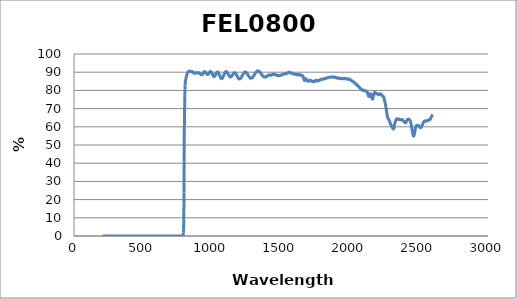
| Category | Series 0 |
|---|---|
| 2600.0 | 66.69 |
| 2599.0 | 66.587 |
| 2598.0 | 66.586 |
| 2597.0 | 66.471 |
| 2596.0 | 66.364 |
| 2595.0 | 66.221 |
| 2594.0 | 66.034 |
| 2593.0 | 66.01 |
| 2592.0 | 65.87 |
| 2591.0 | 65.696 |
| 2590.0 | 65.486 |
| 2589.0 | 65.442 |
| 2588.0 | 65.213 |
| 2587.0 | 65.061 |
| 2586.0 | 64.923 |
| 2585.0 | 64.748 |
| 2584.0 | 64.571 |
| 2583.0 | 64.417 |
| 2582.0 | 64.275 |
| 2581.0 | 64.216 |
| 2580.0 | 64.036 |
| 2579.0 | 63.983 |
| 2578.0 | 63.897 |
| 2577.0 | 63.949 |
| 2576.0 | 63.919 |
| 2575.0 | 63.792 |
| 2574.0 | 63.816 |
| 2573.0 | 63.752 |
| 2572.0 | 63.785 |
| 2571.0 | 63.826 |
| 2570.0 | 63.723 |
| 2569.0 | 63.686 |
| 2568.0 | 63.717 |
| 2567.0 | 63.574 |
| 2566.0 | 63.537 |
| 2565.0 | 63.42 |
| 2564.0 | 63.473 |
| 2563.0 | 63.444 |
| 2562.0 | 63.388 |
| 2561.0 | 63.308 |
| 2560.0 | 63.233 |
| 2559.0 | 63.315 |
| 2558.0 | 63.219 |
| 2557.0 | 63.183 |
| 2556.0 | 63.218 |
| 2555.0 | 63.109 |
| 2554.0 | 63.138 |
| 2553.0 | 63.208 |
| 2552.0 | 63.209 |
| 2551.0 | 63.169 |
| 2550.0 | 63.268 |
| 2549.0 | 63.283 |
| 2548.0 | 63.219 |
| 2547.0 | 63.267 |
| 2546.0 | 63.295 |
| 2545.0 | 63.248 |
| 2544.0 | 63.208 |
| 2543.0 | 63.224 |
| 2542.0 | 63.228 |
| 2541.0 | 63.128 |
| 2540.0 | 63.09 |
| 2539.0 | 63.128 |
| 2538.0 | 62.98 |
| 2537.0 | 62.918 |
| 2536.0 | 62.84 |
| 2535.0 | 62.72 |
| 2534.0 | 62.627 |
| 2533.0 | 62.458 |
| 2532.0 | 62.364 |
| 2531.0 | 62.143 |
| 2530.0 | 61.992 |
| 2529.0 | 61.919 |
| 2528.0 | 61.728 |
| 2527.0 | 61.475 |
| 2526.0 | 61.38 |
| 2525.0 | 61.164 |
| 2524.0 | 60.973 |
| 2523.0 | 60.824 |
| 2522.0 | 60.748 |
| 2521.0 | 60.509 |
| 2520.0 | 60.363 |
| 2519.0 | 60.208 |
| 2518.0 | 60.103 |
| 2517.0 | 59.915 |
| 2516.0 | 59.837 |
| 2515.0 | 59.74 |
| 2514.0 | 59.683 |
| 2513.0 | 59.564 |
| 2512.0 | 59.583 |
| 2511.0 | 59.537 |
| 2510.0 | 59.519 |
| 2509.0 | 59.607 |
| 2508.0 | 59.597 |
| 2507.0 | 59.656 |
| 2506.0 | 59.764 |
| 2505.0 | 59.803 |
| 2504.0 | 59.895 |
| 2503.0 | 60.019 |
| 2502.0 | 60.114 |
| 2501.0 | 60.192 |
| 2500.0 | 60.233 |
| 2499.0 | 60.347 |
| 2498.0 | 60.431 |
| 2497.0 | 60.42 |
| 2496.0 | 60.557 |
| 2495.0 | 60.553 |
| 2494.0 | 60.61 |
| 2493.0 | 60.625 |
| 2492.0 | 60.731 |
| 2491.0 | 60.714 |
| 2490.0 | 60.7 |
| 2489.0 | 60.77 |
| 2488.0 | 60.781 |
| 2487.0 | 60.816 |
| 2486.0 | 60.826 |
| 2485.0 | 60.894 |
| 2484.0 | 60.809 |
| 2483.0 | 60.82 |
| 2482.0 | 60.81 |
| 2481.0 | 60.648 |
| 2480.0 | 60.579 |
| 2479.0 | 60.49 |
| 2478.0 | 60.185 |
| 2477.0 | 60.03 |
| 2476.0 | 59.762 |
| 2475.0 | 59.35 |
| 2474.0 | 58.995 |
| 2473.0 | 58.694 |
| 2472.0 | 58.275 |
| 2471.0 | 57.82 |
| 2470.0 | 57.447 |
| 2469.0 | 57.136 |
| 2468.0 | 56.623 |
| 2467.0 | 56.266 |
| 2466.0 | 55.844 |
| 2465.0 | 55.524 |
| 2464.0 | 55.176 |
| 2463.0 | 55.09 |
| 2462.0 | 54.917 |
| 2461.0 | 54.908 |
| 2460.0 | 55.043 |
| 2459.0 | 55.122 |
| 2458.0 | 55.317 |
| 2457.0 | 55.652 |
| 2456.0 | 56.074 |
| 2455.0 | 56.359 |
| 2454.0 | 56.726 |
| 2453.0 | 57.212 |
| 2452.0 | 57.502 |
| 2451.0 | 57.976 |
| 2450.0 | 58.336 |
| 2449.0 | 58.772 |
| 2448.0 | 59.209 |
| 2447.0 | 59.697 |
| 2446.0 | 60.045 |
| 2445.0 | 60.498 |
| 2444.0 | 60.98 |
| 2443.0 | 61.311 |
| 2442.0 | 61.726 |
| 2441.0 | 62.114 |
| 2440.0 | 62.354 |
| 2439.0 | 62.622 |
| 2438.0 | 62.89 |
| 2437.0 | 63.144 |
| 2436.0 | 63.291 |
| 2435.0 | 63.459 |
| 2434.0 | 63.609 |
| 2433.0 | 63.705 |
| 2432.0 | 63.846 |
| 2431.0 | 63.931 |
| 2430.0 | 63.995 |
| 2429.0 | 64.071 |
| 2428.0 | 64.183 |
| 2427.0 | 64.115 |
| 2426.0 | 64.157 |
| 2425.0 | 64.209 |
| 2424.0 | 64.199 |
| 2423.0 | 64.218 |
| 2422.0 | 64.231 |
| 2421.0 | 64.177 |
| 2420.0 | 64.087 |
| 2419.0 | 64.106 |
| 2418.0 | 64.052 |
| 2417.0 | 63.986 |
| 2416.0 | 63.936 |
| 2415.0 | 63.79 |
| 2414.0 | 63.7 |
| 2413.0 | 63.561 |
| 2412.0 | 63.526 |
| 2411.0 | 63.308 |
| 2410.0 | 63.136 |
| 2409.0 | 63.078 |
| 2408.0 | 62.794 |
| 2407.0 | 62.667 |
| 2406.0 | 62.56 |
| 2405.0 | 62.313 |
| 2404.0 | 62.247 |
| 2403.0 | 62.235 |
| 2402.0 | 62.158 |
| 2401.0 | 62.153 |
| 2400.0 | 62.196 |
| 2399.0 | 62.205 |
| 2398.0 | 62.309 |
| 2397.0 | 62.463 |
| 2396.0 | 62.525 |
| 2395.0 | 62.594 |
| 2394.0 | 62.76 |
| 2393.0 | 62.759 |
| 2392.0 | 62.856 |
| 2391.0 | 63.029 |
| 2390.0 | 63.044 |
| 2389.0 | 63.146 |
| 2388.0 | 63.2 |
| 2387.0 | 63.208 |
| 2386.0 | 63.465 |
| 2385.0 | 63.588 |
| 2384.0 | 63.54 |
| 2383.0 | 63.713 |
| 2382.0 | 63.838 |
| 2381.0 | 63.782 |
| 2380.0 | 63.832 |
| 2379.0 | 63.92 |
| 2378.0 | 63.997 |
| 2377.0 | 63.924 |
| 2376.0 | 63.91 |
| 2375.0 | 63.882 |
| 2374.0 | 63.926 |
| 2373.0 | 63.917 |
| 2372.0 | 63.845 |
| 2371.0 | 63.782 |
| 2370.0 | 63.864 |
| 2369.0 | 63.844 |
| 2368.0 | 63.798 |
| 2367.0 | 63.731 |
| 2366.0 | 63.871 |
| 2365.0 | 63.75 |
| 2364.0 | 63.93 |
| 2363.0 | 63.82 |
| 2362.0 | 63.945 |
| 2361.0 | 63.993 |
| 2360.0 | 64.046 |
| 2359.0 | 64.188 |
| 2358.0 | 64.176 |
| 2357.0 | 64.192 |
| 2356.0 | 64.266 |
| 2355.0 | 64.155 |
| 2354.0 | 64.121 |
| 2353.0 | 64.217 |
| 2352.0 | 64.177 |
| 2351.0 | 64.21 |
| 2350.0 | 64.063 |
| 2349.0 | 64.142 |
| 2348.0 | 64.134 |
| 2347.0 | 64.168 |
| 2346.0 | 64.269 |
| 2345.0 | 64.232 |
| 2344.0 | 64.399 |
| 2343.0 | 64.357 |
| 2342.0 | 64.421 |
| 2341.0 | 64.483 |
| 2340.0 | 64.439 |
| 2339.0 | 64.355 |
| 2338.0 | 64.275 |
| 2337.0 | 64.215 |
| 2336.0 | 64.121 |
| 2335.0 | 64.031 |
| 2334.0 | 63.891 |
| 2333.0 | 63.737 |
| 2332.0 | 63.443 |
| 2331.0 | 63.328 |
| 2330.0 | 63.151 |
| 2329.0 | 62.91 |
| 2328.0 | 62.672 |
| 2327.0 | 62.377 |
| 2326.0 | 62.222 |
| 2325.0 | 61.948 |
| 2324.0 | 61.593 |
| 2323.0 | 61.241 |
| 2322.0 | 60.974 |
| 2321.0 | 60.475 |
| 2320.0 | 60.12 |
| 2319.0 | 59.822 |
| 2318.0 | 59.356 |
| 2317.0 | 59.146 |
| 2316.0 | 58.972 |
| 2315.0 | 58.786 |
| 2314.0 | 58.849 |
| 2313.0 | 58.837 |
| 2312.0 | 58.96 |
| 2311.0 | 59.149 |
| 2310.0 | 59.297 |
| 2309.0 | 59.418 |
| 2308.0 | 59.572 |
| 2307.0 | 59.709 |
| 2306.0 | 59.911 |
| 2305.0 | 59.894 |
| 2304.0 | 60.087 |
| 2303.0 | 60.19 |
| 2302.0 | 60.264 |
| 2301.0 | 60.358 |
| 2300.0 | 60.458 |
| 2299.0 | 60.665 |
| 2298.0 | 60.88 |
| 2297.0 | 61.006 |
| 2296.0 | 61.143 |
| 2295.0 | 61.354 |
| 2294.0 | 61.559 |
| 2293.0 | 61.764 |
| 2292.0 | 61.958 |
| 2291.0 | 62.143 |
| 2290.0 | 62.342 |
| 2289.0 | 62.563 |
| 2288.0 | 62.739 |
| 2287.0 | 62.9 |
| 2286.0 | 63.169 |
| 2285.0 | 63.381 |
| 2284.0 | 63.498 |
| 2283.0 | 63.69 |
| 2282.0 | 63.921 |
| 2281.0 | 63.98 |
| 2280.0 | 64.235 |
| 2279.0 | 64.316 |
| 2278.0 | 64.343 |
| 2277.0 | 64.486 |
| 2276.0 | 64.584 |
| 2275.0 | 64.702 |
| 2274.0 | 64.893 |
| 2273.0 | 65.083 |
| 2272.0 | 65.427 |
| 2271.0 | 65.8 |
| 2270.0 | 66.128 |
| 2269.0 | 66.606 |
| 2268.0 | 67.024 |
| 2267.0 | 67.639 |
| 2266.0 | 68.058 |
| 2265.0 | 68.504 |
| 2264.0 | 69.054 |
| 2263.0 | 69.626 |
| 2262.0 | 70.004 |
| 2261.0 | 70.421 |
| 2260.0 | 70.983 |
| 2259.0 | 71.293 |
| 2258.0 | 71.814 |
| 2257.0 | 72.196 |
| 2256.0 | 72.615 |
| 2255.0 | 73.003 |
| 2254.0 | 73.363 |
| 2253.0 | 73.751 |
| 2252.0 | 74.07 |
| 2251.0 | 74.346 |
| 2250.0 | 74.808 |
| 2249.0 | 75.024 |
| 2248.0 | 75.298 |
| 2247.0 | 75.515 |
| 2246.0 | 75.762 |
| 2245.0 | 75.974 |
| 2244.0 | 76.164 |
| 2243.0 | 76.321 |
| 2242.0 | 76.366 |
| 2241.0 | 76.568 |
| 2240.0 | 76.589 |
| 2239.0 | 76.918 |
| 2238.0 | 76.866 |
| 2237.0 | 76.965 |
| 2236.0 | 76.919 |
| 2235.0 | 76.982 |
| 2234.0 | 77.073 |
| 2233.0 | 77.063 |
| 2232.0 | 77.169 |
| 2231.0 | 77.331 |
| 2230.0 | 77.365 |
| 2229.0 | 77.508 |
| 2228.0 | 77.588 |
| 2227.0 | 77.605 |
| 2226.0 | 77.742 |
| 2225.0 | 77.858 |
| 2224.0 | 77.967 |
| 2223.0 | 77.963 |
| 2222.0 | 77.97 |
| 2221.0 | 78.1 |
| 2220.0 | 77.986 |
| 2219.0 | 77.957 |
| 2218.0 | 78.046 |
| 2217.0 | 77.958 |
| 2216.0 | 77.927 |
| 2215.0 | 77.864 |
| 2214.0 | 77.788 |
| 2213.0 | 77.774 |
| 2212.0 | 77.76 |
| 2211.0 | 77.663 |
| 2210.0 | 77.637 |
| 2209.0 | 77.595 |
| 2208.0 | 77.706 |
| 2207.0 | 77.621 |
| 2206.0 | 77.706 |
| 2205.0 | 77.716 |
| 2204.0 | 77.789 |
| 2203.0 | 77.9 |
| 2202.0 | 77.95 |
| 2201.0 | 78.073 |
| 2200.0 | 78.164 |
| 2199.0 | 78.034 |
| 2198.0 | 78.177 |
| 2197.0 | 78.277 |
| 2196.0 | 78.249 |
| 2195.0 | 78.186 |
| 2194.0 | 78.213 |
| 2193.0 | 78.152 |
| 2192.0 | 78.113 |
| 2191.0 | 78.195 |
| 2190.0 | 78.211 |
| 2189.0 | 78.18 |
| 2188.0 | 78.199 |
| 2187.0 | 78.316 |
| 2186.0 | 78.414 |
| 2185.0 | 78.525 |
| 2184.0 | 78.492 |
| 2183.0 | 78.643 |
| 2182.0 | 78.823 |
| 2181.0 | 78.742 |
| 2180.0 | 78.822 |
| 2179.0 | 78.852 |
| 2178.0 | 78.895 |
| 2177.0 | 78.841 |
| 2176.0 | 78.716 |
| 2175.0 | 78.559 |
| 2174.0 | 78.457 |
| 2173.0 | 78.231 |
| 2172.0 | 77.878 |
| 2171.0 | 77.593 |
| 2170.0 | 77.255 |
| 2169.0 | 76.914 |
| 2168.0 | 76.436 |
| 2167.0 | 76.153 |
| 2166.0 | 75.685 |
| 2165.0 | 75.388 |
| 2164.0 | 75.322 |
| 2163.0 | 75.221 |
| 2162.0 | 75.27 |
| 2161.0 | 75.371 |
| 2160.0 | 75.573 |
| 2159.0 | 75.745 |
| 2158.0 | 76.058 |
| 2157.0 | 76.431 |
| 2156.0 | 76.752 |
| 2155.0 | 77.125 |
| 2154.0 | 77.37 |
| 2153.0 | 77.619 |
| 2152.0 | 77.913 |
| 2151.0 | 77.932 |
| 2150.0 | 78.049 |
| 2149.0 | 78.14 |
| 2148.0 | 78.185 |
| 2147.0 | 78.109 |
| 2146.0 | 78.119 |
| 2145.0 | 77.923 |
| 2144.0 | 77.78 |
| 2143.0 | 77.553 |
| 2142.0 | 77.439 |
| 2141.0 | 77.179 |
| 2140.0 | 77.03 |
| 2139.0 | 76.883 |
| 2138.0 | 76.7 |
| 2137.0 | 76.621 |
| 2136.0 | 76.657 |
| 2135.0 | 76.772 |
| 2134.0 | 76.896 |
| 2133.0 | 77.041 |
| 2132.0 | 77.319 |
| 2131.0 | 77.605 |
| 2130.0 | 77.835 |
| 2129.0 | 78.164 |
| 2128.0 | 78.488 |
| 2127.0 | 78.652 |
| 2126.0 | 78.861 |
| 2125.0 | 78.925 |
| 2124.0 | 79.033 |
| 2123.0 | 79.12 |
| 2122.0 | 79.379 |
| 2121.0 | 79.268 |
| 2120.0 | 79.289 |
| 2119.0 | 79.385 |
| 2118.0 | 79.542 |
| 2117.0 | 79.489 |
| 2116.0 | 79.589 |
| 2115.0 | 79.617 |
| 2114.0 | 79.707 |
| 2113.0 | 79.637 |
| 2112.0 | 79.744 |
| 2111.0 | 79.684 |
| 2110.0 | 79.803 |
| 2109.0 | 79.843 |
| 2108.0 | 79.793 |
| 2107.0 | 79.907 |
| 2106.0 | 79.879 |
| 2105.0 | 79.933 |
| 2104.0 | 79.985 |
| 2103.0 | 80.023 |
| 2102.0 | 79.972 |
| 2101.0 | 79.965 |
| 2100.0 | 79.989 |
| 2099.0 | 79.961 |
| 2098.0 | 80 |
| 2097.0 | 79.969 |
| 2096.0 | 80.063 |
| 2095.0 | 80.203 |
| 2094.0 | 79.996 |
| 2093.0 | 80.047 |
| 2092.0 | 80.104 |
| 2091.0 | 80.184 |
| 2090.0 | 80.275 |
| 2089.0 | 80.213 |
| 2088.0 | 80.304 |
| 2087.0 | 80.319 |
| 2086.0 | 80.372 |
| 2085.0 | 80.39 |
| 2084.0 | 80.425 |
| 2083.0 | 80.536 |
| 2082.0 | 80.604 |
| 2081.0 | 80.717 |
| 2080.0 | 80.745 |
| 2079.0 | 80.743 |
| 2078.0 | 80.905 |
| 2077.0 | 80.89 |
| 2076.0 | 80.987 |
| 2075.0 | 81.086 |
| 2074.0 | 81.162 |
| 2073.0 | 81.225 |
| 2072.0 | 81.33 |
| 2071.0 | 81.499 |
| 2070.0 | 81.508 |
| 2069.0 | 81.517 |
| 2068.0 | 81.64 |
| 2067.0 | 81.638 |
| 2066.0 | 81.91 |
| 2065.0 | 81.867 |
| 2064.0 | 81.94 |
| 2063.0 | 82.066 |
| 2062.0 | 82.169 |
| 2061.0 | 82.23 |
| 2060.0 | 82.323 |
| 2059.0 | 82.335 |
| 2058.0 | 82.439 |
| 2057.0 | 82.585 |
| 2056.0 | 82.575 |
| 2055.0 | 82.742 |
| 2054.0 | 82.742 |
| 2053.0 | 82.655 |
| 2052.0 | 82.869 |
| 2051.0 | 83.002 |
| 2050.0 | 82.987 |
| 2049.0 | 83.04 |
| 2048.0 | 83.129 |
| 2047.0 | 83.253 |
| 2046.0 | 83.204 |
| 2045.0 | 83.33 |
| 2044.0 | 83.442 |
| 2043.0 | 83.425 |
| 2042.0 | 83.575 |
| 2041.0 | 83.486 |
| 2040.0 | 83.671 |
| 2039.0 | 83.74 |
| 2038.0 | 83.737 |
| 2037.0 | 83.866 |
| 2036.0 | 83.961 |
| 2035.0 | 84.01 |
| 2034.0 | 84.171 |
| 2033.0 | 84.285 |
| 2032.0 | 84.291 |
| 2031.0 | 84.445 |
| 2030.0 | 84.391 |
| 2029.0 | 84.501 |
| 2028.0 | 84.498 |
| 2027.0 | 84.629 |
| 2026.0 | 84.644 |
| 2025.0 | 84.68 |
| 2024.0 | 84.75 |
| 2023.0 | 84.774 |
| 2022.0 | 84.922 |
| 2021.0 | 84.936 |
| 2020.0 | 84.953 |
| 2019.0 | 84.995 |
| 2018.0 | 85.018 |
| 2017.0 | 85.059 |
| 2016.0 | 85.086 |
| 2015.0 | 85.258 |
| 2014.0 | 85.152 |
| 2013.0 | 85.295 |
| 2012.0 | 85.358 |
| 2011.0 | 85.431 |
| 2010.0 | 85.358 |
| 2009.0 | 85.491 |
| 2008.0 | 85.601 |
| 2007.0 | 85.563 |
| 2006.0 | 85.651 |
| 2005.0 | 85.681 |
| 2004.0 | 85.746 |
| 2003.0 | 85.754 |
| 2002.0 | 85.783 |
| 2001.0 | 85.872 |
| 2000.0 | 85.897 |
| 1999.0 | 85.941 |
| 1998.0 | 86.012 |
| 1997.0 | 86.049 |
| 1996.0 | 86.228 |
| 1995.0 | 86.085 |
| 1994.0 | 86.195 |
| 1993.0 | 86.279 |
| 1992.0 | 86.224 |
| 1991.0 | 86.237 |
| 1990.0 | 86.033 |
| 1989.0 | 86.264 |
| 1988.0 | 86.166 |
| 1987.0 | 86.278 |
| 1986.0 | 86.277 |
| 1985.0 | 86.238 |
| 1984.0 | 86.315 |
| 1983.0 | 86.38 |
| 1982.0 | 86.318 |
| 1981.0 | 86.323 |
| 1980.0 | 86.404 |
| 1979.0 | 86.339 |
| 1978.0 | 86.408 |
| 1977.0 | 86.3 |
| 1976.0 | 86.43 |
| 1975.0 | 86.265 |
| 1974.0 | 86.315 |
| 1973.0 | 86.368 |
| 1972.0 | 86.488 |
| 1971.0 | 86.35 |
| 1970.0 | 86.385 |
| 1969.0 | 86.331 |
| 1968.0 | 86.38 |
| 1967.0 | 86.476 |
| 1966.0 | 86.409 |
| 1965.0 | 86.454 |
| 1964.0 | 86.538 |
| 1963.0 | 86.38 |
| 1962.0 | 86.467 |
| 1961.0 | 86.443 |
| 1960.0 | 86.456 |
| 1959.0 | 86.407 |
| 1958.0 | 86.436 |
| 1957.0 | 86.551 |
| 1956.0 | 86.457 |
| 1955.0 | 86.502 |
| 1954.0 | 86.514 |
| 1953.0 | 86.522 |
| 1952.0 | 86.552 |
| 1951.0 | 86.515 |
| 1950.0 | 86.464 |
| 1949.0 | 86.565 |
| 1948.0 | 86.494 |
| 1947.0 | 86.598 |
| 1946.0 | 86.418 |
| 1945.0 | 86.48 |
| 1944.0 | 86.448 |
| 1943.0 | 86.559 |
| 1942.0 | 86.595 |
| 1941.0 | 86.55 |
| 1940.0 | 86.515 |
| 1939.0 | 86.458 |
| 1938.0 | 86.448 |
| 1937.0 | 86.492 |
| 1936.0 | 86.536 |
| 1935.0 | 86.588 |
| 1934.0 | 86.572 |
| 1933.0 | 86.477 |
| 1932.0 | 86.534 |
| 1931.0 | 86.581 |
| 1930.0 | 86.538 |
| 1929.0 | 86.597 |
| 1928.0 | 86.576 |
| 1927.0 | 86.527 |
| 1926.0 | 86.606 |
| 1925.0 | 86.597 |
| 1924.0 | 86.516 |
| 1923.0 | 86.654 |
| 1922.0 | 86.745 |
| 1921.0 | 86.814 |
| 1920.0 | 86.703 |
| 1919.0 | 86.687 |
| 1918.0 | 86.745 |
| 1917.0 | 86.619 |
| 1916.0 | 86.653 |
| 1915.0 | 86.767 |
| 1914.0 | 86.796 |
| 1913.0 | 86.745 |
| 1912.0 | 86.713 |
| 1911.0 | 86.754 |
| 1910.0 | 86.736 |
| 1909.0 | 86.758 |
| 1908.0 | 86.759 |
| 1907.0 | 86.964 |
| 1906.0 | 86.925 |
| 1905.0 | 86.938 |
| 1904.0 | 86.891 |
| 1903.0 | 86.837 |
| 1902.0 | 86.991 |
| 1901.0 | 86.999 |
| 1900.0 | 86.979 |
| 1899.0 | 87.024 |
| 1898.0 | 86.985 |
| 1897.0 | 87.109 |
| 1896.0 | 87.037 |
| 1895.0 | 87.151 |
| 1894.0 | 87.138 |
| 1893.0 | 87.122 |
| 1892.0 | 87.238 |
| 1891.0 | 87.159 |
| 1890.0 | 87.202 |
| 1889.0 | 87.302 |
| 1888.0 | 87.256 |
| 1887.0 | 87.303 |
| 1886.0 | 87.35 |
| 1885.0 | 87.203 |
| 1884.0 | 87.282 |
| 1883.0 | 87.243 |
| 1882.0 | 87.289 |
| 1881.0 | 87.259 |
| 1880.0 | 87.343 |
| 1879.0 | 87.332 |
| 1878.0 | 87.298 |
| 1877.0 | 87.418 |
| 1876.0 | 87.357 |
| 1875.0 | 87.263 |
| 1874.0 | 87.327 |
| 1873.0 | 87.375 |
| 1872.0 | 87.269 |
| 1871.0 | 87.339 |
| 1870.0 | 87.318 |
| 1869.0 | 87.402 |
| 1868.0 | 87.251 |
| 1867.0 | 87.326 |
| 1866.0 | 87.298 |
| 1865.0 | 87.344 |
| 1864.0 | 87.333 |
| 1863.0 | 87.396 |
| 1862.0 | 87.401 |
| 1861.0 | 87.366 |
| 1860.0 | 87.401 |
| 1859.0 | 87.337 |
| 1858.0 | 87.288 |
| 1857.0 | 87.334 |
| 1856.0 | 87.28 |
| 1855.0 | 87.236 |
| 1854.0 | 87.246 |
| 1853.0 | 87.195 |
| 1852.0 | 87.281 |
| 1851.0 | 87.215 |
| 1850.0 | 87.207 |
| 1849.0 | 87.275 |
| 1848.0 | 87.168 |
| 1847.0 | 87.127 |
| 1846.0 | 87.112 |
| 1845.0 | 87.074 |
| 1844.0 | 87.009 |
| 1843.0 | 87.131 |
| 1842.0 | 87.071 |
| 1841.0 | 86.994 |
| 1840.0 | 86.995 |
| 1839.0 | 86.939 |
| 1838.0 | 87.001 |
| 1837.0 | 86.949 |
| 1836.0 | 86.933 |
| 1835.0 | 86.886 |
| 1834.0 | 86.79 |
| 1833.0 | 86.849 |
| 1832.0 | 86.848 |
| 1831.0 | 86.761 |
| 1830.0 | 86.77 |
| 1829.0 | 86.673 |
| 1828.0 | 86.737 |
| 1827.0 | 86.72 |
| 1826.0 | 86.646 |
| 1825.0 | 86.592 |
| 1824.0 | 86.599 |
| 1823.0 | 86.594 |
| 1822.0 | 86.588 |
| 1821.0 | 86.602 |
| 1820.0 | 86.653 |
| 1819.0 | 86.583 |
| 1818.0 | 86.533 |
| 1817.0 | 86.449 |
| 1816.0 | 86.476 |
| 1815.0 | 86.405 |
| 1814.0 | 86.409 |
| 1813.0 | 86.451 |
| 1812.0 | 86.407 |
| 1811.0 | 86.438 |
| 1810.0 | 86.321 |
| 1809.0 | 86.364 |
| 1808.0 | 86.224 |
| 1807.0 | 86.308 |
| 1806.0 | 86.388 |
| 1805.0 | 86.175 |
| 1804.0 | 86.272 |
| 1803.0 | 86.224 |
| 1802.0 | 86.186 |
| 1801.0 | 86.226 |
| 1800.0 | 86.19 |
| 1799.0 | 86.151 |
| 1798.0 | 86.197 |
| 1797.0 | 86.119 |
| 1796.0 | 86.09 |
| 1795.0 | 86.054 |
| 1794.0 | 86.101 |
| 1793.0 | 86.02 |
| 1792.0 | 86.058 |
| 1791.0 | 85.96 |
| 1790.0 | 85.934 |
| 1789.0 | 85.939 |
| 1788.0 | 85.941 |
| 1787.0 | 85.85 |
| 1786.0 | 85.866 |
| 1785.0 | 85.86 |
| 1784.0 | 85.813 |
| 1783.0 | 85.687 |
| 1782.0 | 85.747 |
| 1781.0 | 85.644 |
| 1780.0 | 85.563 |
| 1779.0 | 85.607 |
| 1778.0 | 85.578 |
| 1777.0 | 85.693 |
| 1776.0 | 85.546 |
| 1775.0 | 85.443 |
| 1774.0 | 85.293 |
| 1773.0 | 85.271 |
| 1772.0 | 85.277 |
| 1771.0 | 85.288 |
| 1770.0 | 85.23 |
| 1769.0 | 85.199 |
| 1768.0 | 85.197 |
| 1767.0 | 85.281 |
| 1766.0 | 85.185 |
| 1765.0 | 85.298 |
| 1764.0 | 85.286 |
| 1763.0 | 85.387 |
| 1762.0 | 85.327 |
| 1761.0 | 85.416 |
| 1760.0 | 85.366 |
| 1759.0 | 85.444 |
| 1758.0 | 85.399 |
| 1757.0 | 85.37 |
| 1756.0 | 85.499 |
| 1755.0 | 85.503 |
| 1754.0 | 85.497 |
| 1753.0 | 85.385 |
| 1752.0 | 85.53 |
| 1751.0 | 85.484 |
| 1750.0 | 85.411 |
| 1749.0 | 85.388 |
| 1748.0 | 85.285 |
| 1747.0 | 85.245 |
| 1746.0 | 85.153 |
| 1745.0 | 85.148 |
| 1744.0 | 85.057 |
| 1743.0 | 84.997 |
| 1742.0 | 84.807 |
| 1741.0 | 84.874 |
| 1740.0 | 84.74 |
| 1739.0 | 84.813 |
| 1738.0 | 84.698 |
| 1737.0 | 84.762 |
| 1736.0 | 84.757 |
| 1735.0 | 84.745 |
| 1734.0 | 84.779 |
| 1733.0 | 84.806 |
| 1732.0 | 84.784 |
| 1731.0 | 84.921 |
| 1730.0 | 85.045 |
| 1729.0 | 85.021 |
| 1728.0 | 85.098 |
| 1727.0 | 85.029 |
| 1726.0 | 84.97 |
| 1725.0 | 85.049 |
| 1724.0 | 84.978 |
| 1723.0 | 85.087 |
| 1722.0 | 85.105 |
| 1721.0 | 85.035 |
| 1720.0 | 85.222 |
| 1719.0 | 85.173 |
| 1718.0 | 85.354 |
| 1717.0 | 85.457 |
| 1716.0 | 85.402 |
| 1715.0 | 85.526 |
| 1714.0 | 85.48 |
| 1713.0 | 85.623 |
| 1712.0 | 85.629 |
| 1711.0 | 85.637 |
| 1710.0 | 85.606 |
| 1709.0 | 85.643 |
| 1708.0 | 85.399 |
| 1707.0 | 85.489 |
| 1706.0 | 85.391 |
| 1705.0 | 85.362 |
| 1704.0 | 85.21 |
| 1703.0 | 85.146 |
| 1702.0 | 85.061 |
| 1701.0 | 84.97 |
| 1700.0 | 85 |
| 1699.0 | 84.971 |
| 1698.0 | 85.125 |
| 1697.0 | 85.279 |
| 1696.0 | 85.31 |
| 1695.0 | 85.363 |
| 1694.0 | 85.329 |
| 1693.0 | 85.446 |
| 1692.0 | 85.454 |
| 1691.0 | 85.492 |
| 1690.0 | 85.395 |
| 1689.0 | 85.422 |
| 1688.0 | 85.4 |
| 1687.0 | 85.667 |
| 1686.0 | 85.706 |
| 1685.0 | 85.874 |
| 1684.0 | 85.963 |
| 1683.0 | 86.136 |
| 1682.0 | 86.358 |
| 1681.0 | 86.391 |
| 1680.0 | 86.479 |
| 1679.0 | 86.429 |
| 1678.0 | 86.389 |
| 1677.0 | 86.291 |
| 1676.0 | 86.109 |
| 1675.0 | 85.984 |
| 1674.0 | 85.851 |
| 1673.0 | 85.663 |
| 1672.0 | 85.651 |
| 1671.0 | 85.491 |
| 1670.0 | 85.536 |
| 1669.0 | 85.497 |
| 1668.0 | 85.715 |
| 1667.0 | 85.839 |
| 1666.0 | 86.134 |
| 1665.0 | 86.411 |
| 1664.0 | 86.611 |
| 1663.0 | 86.989 |
| 1662.0 | 87.147 |
| 1661.0 | 87.346 |
| 1660.0 | 87.634 |
| 1659.0 | 87.828 |
| 1658.0 | 87.988 |
| 1657.0 | 88.038 |
| 1656.0 | 88.031 |
| 1655.0 | 88.115 |
| 1654.0 | 88.184 |
| 1653.0 | 88.193 |
| 1652.0 | 88.226 |
| 1651.0 | 88.279 |
| 1650.0 | 88.164 |
| 1649.0 | 88.216 |
| 1648.0 | 88.114 |
| 1647.0 | 88.164 |
| 1646.0 | 88.271 |
| 1645.0 | 88.318 |
| 1644.0 | 88.28 |
| 1643.0 | 88.432 |
| 1642.0 | 88.529 |
| 1641.0 | 88.521 |
| 1640.0 | 88.522 |
| 1639.0 | 88.464 |
| 1638.0 | 88.612 |
| 1637.0 | 88.479 |
| 1636.0 | 88.457 |
| 1635.0 | 88.666 |
| 1634.0 | 88.59 |
| 1633.0 | 88.645 |
| 1632.0 | 88.526 |
| 1631.0 | 88.615 |
| 1630.0 | 88.629 |
| 1629.0 | 88.692 |
| 1628.0 | 88.606 |
| 1627.0 | 88.637 |
| 1626.0 | 88.69 |
| 1625.0 | 88.507 |
| 1624.0 | 88.596 |
| 1623.0 | 88.695 |
| 1622.0 | 88.561 |
| 1621.0 | 88.604 |
| 1620.0 | 88.614 |
| 1619.0 | 88.588 |
| 1618.0 | 88.634 |
| 1617.0 | 88.654 |
| 1616.0 | 88.58 |
| 1615.0 | 88.68 |
| 1614.0 | 88.616 |
| 1613.0 | 88.567 |
| 1612.0 | 88.706 |
| 1611.0 | 88.681 |
| 1610.0 | 88.765 |
| 1609.0 | 88.725 |
| 1608.0 | 88.674 |
| 1607.0 | 88.763 |
| 1606.0 | 88.792 |
| 1605.0 | 88.704 |
| 1604.0 | 88.778 |
| 1603.0 | 88.817 |
| 1602.0 | 88.802 |
| 1601.0 | 88.791 |
| 1600.0 | 88.807 |
| 1599.0 | 88.874 |
| 1598.0 | 88.876 |
| 1597.0 | 88.934 |
| 1596.0 | 88.993 |
| 1595.0 | 88.95 |
| 1594.0 | 89.044 |
| 1593.0 | 88.991 |
| 1592.0 | 89.041 |
| 1591.0 | 89.081 |
| 1590.0 | 89.071 |
| 1589.0 | 89.142 |
| 1588.0 | 89.077 |
| 1587.0 | 89.215 |
| 1586.0 | 89.249 |
| 1585.0 | 89.217 |
| 1584.0 | 89.258 |
| 1583.0 | 89.333 |
| 1582.0 | 89.384 |
| 1581.0 | 89.284 |
| 1580.0 | 89.441 |
| 1579.0 | 89.471 |
| 1578.0 | 89.41 |
| 1577.0 | 89.488 |
| 1576.0 | 89.479 |
| 1575.0 | 89.601 |
| 1574.0 | 89.644 |
| 1573.0 | 89.623 |
| 1572.0 | 89.562 |
| 1571.0 | 89.645 |
| 1570.0 | 89.68 |
| 1569.0 | 89.722 |
| 1568.0 | 89.727 |
| 1567.0 | 89.614 |
| 1566.0 | 89.813 |
| 1565.0 | 89.772 |
| 1564.0 | 89.821 |
| 1563.0 | 89.752 |
| 1562.0 | 89.779 |
| 1561.0 | 89.941 |
| 1560.0 | 89.921 |
| 1559.0 | 89.8 |
| 1558.0 | 89.828 |
| 1557.0 | 89.878 |
| 1556.0 | 89.989 |
| 1555.0 | 89.763 |
| 1554.0 | 89.799 |
| 1553.0 | 89.777 |
| 1552.0 | 89.712 |
| 1551.0 | 89.749 |
| 1550.0 | 89.587 |
| 1549.0 | 89.586 |
| 1548.0 | 89.591 |
| 1547.0 | 89.445 |
| 1546.0 | 89.455 |
| 1545.0 | 89.386 |
| 1544.0 | 89.427 |
| 1543.0 | 89.332 |
| 1542.0 | 89.371 |
| 1541.0 | 89.289 |
| 1540.0 | 89.457 |
| 1539.0 | 89.414 |
| 1538.0 | 89.239 |
| 1537.0 | 89.279 |
| 1536.0 | 89.261 |
| 1535.0 | 89.112 |
| 1534.0 | 89.136 |
| 1533.0 | 89.257 |
| 1532.0 | 89.207 |
| 1531.0 | 89.207 |
| 1530.0 | 89.065 |
| 1529.0 | 89.033 |
| 1528.0 | 89.063 |
| 1527.0 | 89.13 |
| 1526.0 | 89.131 |
| 1525.0 | 89.098 |
| 1524.0 | 89.097 |
| 1523.0 | 89.077 |
| 1522.0 | 89.011 |
| 1521.0 | 89.023 |
| 1520.0 | 89.03 |
| 1519.0 | 88.916 |
| 1518.0 | 88.885 |
| 1517.0 | 88.832 |
| 1516.0 | 88.951 |
| 1515.0 | 88.846 |
| 1514.0 | 88.895 |
| 1513.0 | 88.858 |
| 1512.0 | 88.804 |
| 1511.0 | 88.794 |
| 1510.0 | 88.747 |
| 1509.0 | 88.672 |
| 1508.0 | 88.577 |
| 1507.0 | 88.59 |
| 1506.0 | 88.509 |
| 1505.0 | 88.606 |
| 1504.0 | 88.482 |
| 1503.0 | 88.46 |
| 1502.0 | 88.435 |
| 1501.0 | 88.423 |
| 1500.0 | 88.38 |
| 1499.0 | 88.273 |
| 1498.0 | 88.246 |
| 1497.0 | 88.26 |
| 1496.0 | 88.291 |
| 1495.0 | 88.208 |
| 1494.0 | 88.236 |
| 1493.0 | 88.208 |
| 1492.0 | 88.117 |
| 1491.0 | 88.102 |
| 1490.0 | 88.18 |
| 1489.0 | 88.146 |
| 1488.0 | 88.093 |
| 1487.0 | 88.106 |
| 1486.0 | 88.016 |
| 1485.0 | 88.118 |
| 1484.0 | 88.112 |
| 1483.0 | 88.077 |
| 1482.0 | 88.213 |
| 1481.0 | 88.189 |
| 1480.0 | 88.167 |
| 1479.0 | 88.191 |
| 1478.0 | 88.17 |
| 1477.0 | 88.164 |
| 1476.0 | 88.234 |
| 1475.0 | 88.199 |
| 1474.0 | 88.319 |
| 1473.0 | 88.305 |
| 1472.0 | 88.315 |
| 1471.0 | 88.362 |
| 1470.0 | 88.358 |
| 1469.0 | 88.387 |
| 1468.0 | 88.351 |
| 1467.0 | 88.48 |
| 1466.0 | 88.363 |
| 1465.0 | 88.497 |
| 1464.0 | 88.528 |
| 1463.0 | 88.616 |
| 1462.0 | 88.63 |
| 1461.0 | 88.676 |
| 1460.0 | 88.689 |
| 1459.0 | 88.642 |
| 1458.0 | 88.739 |
| 1457.0 | 88.772 |
| 1456.0 | 88.698 |
| 1455.0 | 88.712 |
| 1454.0 | 88.781 |
| 1453.0 | 88.806 |
| 1452.0 | 88.834 |
| 1451.0 | 88.922 |
| 1450.0 | 88.91 |
| 1449.0 | 88.872 |
| 1448.0 | 88.935 |
| 1447.0 | 88.86 |
| 1446.0 | 88.847 |
| 1445.0 | 88.932 |
| 1444.0 | 88.885 |
| 1443.0 | 88.839 |
| 1442.0 | 88.851 |
| 1441.0 | 88.803 |
| 1440.0 | 88.718 |
| 1439.0 | 88.77 |
| 1438.0 | 88.759 |
| 1437.0 | 88.804 |
| 1436.0 | 88.536 |
| 1435.0 | 88.67 |
| 1434.0 | 88.561 |
| 1433.0 | 88.569 |
| 1432.0 | 88.463 |
| 1431.0 | 88.466 |
| 1430.0 | 88.37 |
| 1429.0 | 88.498 |
| 1428.0 | 88.382 |
| 1427.0 | 88.408 |
| 1426.0 | 88.395 |
| 1425.0 | 88.338 |
| 1424.0 | 88.29 |
| 1423.0 | 88.396 |
| 1422.0 | 88.384 |
| 1421.0 | 88.348 |
| 1420.0 | 88.387 |
| 1419.0 | 88.488 |
| 1418.0 | 88.544 |
| 1417.0 | 88.466 |
| 1416.0 | 88.444 |
| 1415.0 | 88.492 |
| 1414.0 | 88.471 |
| 1413.0 | 88.506 |
| 1412.0 | 88.489 |
| 1411.0 | 88.384 |
| 1410.0 | 88.425 |
| 1409.0 | 88.378 |
| 1408.0 | 88.267 |
| 1407.0 | 88.185 |
| 1406.0 | 88.128 |
| 1405.0 | 88.206 |
| 1404.0 | 88.042 |
| 1403.0 | 88.078 |
| 1402.0 | 88.046 |
| 1401.0 | 87.904 |
| 1400.0 | 87.898 |
| 1399.0 | 87.837 |
| 1398.0 | 87.728 |
| 1397.0 | 87.756 |
| 1396.0 | 87.623 |
| 1395.0 | 87.55 |
| 1394.0 | 87.513 |
| 1393.0 | 87.51 |
| 1392.0 | 87.439 |
| 1391.0 | 87.379 |
| 1390.0 | 87.374 |
| 1389.0 | 87.467 |
| 1388.0 | 87.462 |
| 1387.0 | 87.403 |
| 1386.0 | 87.365 |
| 1385.0 | 87.407 |
| 1384.0 | 87.351 |
| 1383.0 | 87.484 |
| 1382.0 | 87.311 |
| 1381.0 | 87.285 |
| 1380.0 | 87.352 |
| 1379.0 | 87.397 |
| 1378.0 | 87.487 |
| 1377.0 | 87.458 |
| 1376.0 | 87.543 |
| 1375.0 | 87.645 |
| 1374.0 | 87.661 |
| 1373.0 | 87.678 |
| 1372.0 | 87.684 |
| 1371.0 | 87.72 |
| 1370.0 | 87.839 |
| 1369.0 | 87.93 |
| 1368.0 | 88.013 |
| 1367.0 | 88.05 |
| 1366.0 | 88.106 |
| 1365.0 | 88.175 |
| 1364.0 | 88.357 |
| 1363.0 | 88.338 |
| 1362.0 | 88.564 |
| 1361.0 | 88.603 |
| 1360.0 | 88.667 |
| 1359.0 | 88.753 |
| 1358.0 | 88.874 |
| 1357.0 | 89.035 |
| 1356.0 | 89.041 |
| 1355.0 | 89.23 |
| 1354.0 | 89.287 |
| 1353.0 | 89.479 |
| 1352.0 | 89.582 |
| 1351.0 | 89.634 |
| 1350.0 | 89.734 |
| 1349.0 | 89.828 |
| 1348.0 | 89.884 |
| 1347.0 | 90.055 |
| 1346.0 | 90.159 |
| 1345.0 | 90.197 |
| 1344.0 | 90.184 |
| 1343.0 | 90.364 |
| 1342.0 | 90.427 |
| 1341.0 | 90.5 |
| 1340.0 | 90.474 |
| 1339.0 | 90.585 |
| 1338.0 | 90.558 |
| 1337.0 | 90.534 |
| 1336.0 | 90.672 |
| 1335.0 | 90.641 |
| 1334.0 | 90.743 |
| 1333.0 | 90.651 |
| 1332.0 | 90.765 |
| 1331.0 | 90.694 |
| 1330.0 | 90.74 |
| 1329.0 | 90.666 |
| 1328.0 | 90.674 |
| 1327.0 | 90.542 |
| 1326.0 | 90.512 |
| 1325.0 | 90.453 |
| 1324.0 | 90.319 |
| 1323.0 | 90.306 |
| 1322.0 | 90.247 |
| 1321.0 | 90.11 |
| 1320.0 | 90.161 |
| 1319.0 | 90.026 |
| 1318.0 | 89.912 |
| 1317.0 | 89.735 |
| 1316.0 | 89.652 |
| 1315.0 | 89.626 |
| 1314.0 | 89.507 |
| 1313.0 | 89.309 |
| 1312.0 | 89.297 |
| 1311.0 | 89.126 |
| 1310.0 | 89.049 |
| 1309.0 | 88.796 |
| 1308.0 | 88.729 |
| 1307.0 | 88.635 |
| 1306.0 | 88.566 |
| 1305.0 | 88.345 |
| 1304.0 | 88.224 |
| 1303.0 | 88.139 |
| 1302.0 | 88.061 |
| 1301.0 | 87.895 |
| 1300.0 | 87.747 |
| 1299.0 | 87.728 |
| 1298.0 | 87.556 |
| 1297.0 | 87.498 |
| 1296.0 | 87.305 |
| 1295.0 | 87.226 |
| 1294.0 | 87.123 |
| 1293.0 | 87.187 |
| 1292.0 | 87.068 |
| 1291.0 | 86.891 |
| 1290.0 | 86.848 |
| 1289.0 | 86.878 |
| 1288.0 | 86.805 |
| 1287.0 | 86.799 |
| 1286.0 | 86.784 |
| 1285.0 | 86.689 |
| 1284.0 | 86.631 |
| 1283.0 | 86.722 |
| 1282.0 | 86.688 |
| 1281.0 | 86.734 |
| 1280.0 | 86.798 |
| 1279.0 | 86.759 |
| 1278.0 | 86.846 |
| 1277.0 | 86.946 |
| 1276.0 | 86.81 |
| 1275.0 | 86.927 |
| 1274.0 | 87.127 |
| 1273.0 | 87.035 |
| 1272.0 | 87.251 |
| 1271.0 | 87.297 |
| 1270.0 | 87.365 |
| 1269.0 | 87.505 |
| 1268.0 | 87.616 |
| 1267.0 | 87.684 |
| 1266.0 | 87.834 |
| 1265.0 | 87.961 |
| 1264.0 | 88.086 |
| 1263.0 | 88.157 |
| 1262.0 | 88.291 |
| 1261.0 | 88.374 |
| 1260.0 | 88.556 |
| 1259.0 | 88.726 |
| 1258.0 | 88.79 |
| 1257.0 | 89.069 |
| 1256.0 | 89.106 |
| 1255.0 | 89.204 |
| 1254.0 | 89.274 |
| 1253.0 | 89.364 |
| 1252.0 | 89.336 |
| 1251.0 | 89.679 |
| 1250.0 | 89.673 |
| 1249.0 | 89.654 |
| 1248.0 | 89.888 |
| 1247.0 | 89.856 |
| 1246.0 | 90.064 |
| 1245.0 | 89.966 |
| 1244.0 | 90.058 |
| 1243.0 | 89.987 |
| 1242.0 | 90.087 |
| 1241.0 | 90.061 |
| 1240.0 | 90.156 |
| 1239.0 | 89.989 |
| 1238.0 | 90.048 |
| 1237.0 | 90.053 |
| 1236.0 | 89.96 |
| 1235.0 | 89.966 |
| 1234.0 | 89.814 |
| 1233.0 | 89.701 |
| 1232.0 | 89.627 |
| 1231.0 | 89.644 |
| 1230.0 | 89.473 |
| 1229.0 | 89.415 |
| 1228.0 | 89.283 |
| 1227.0 | 89.197 |
| 1226.0 | 89.028 |
| 1225.0 | 88.961 |
| 1224.0 | 88.657 |
| 1223.0 | 88.606 |
| 1222.0 | 88.539 |
| 1221.0 | 88.208 |
| 1220.0 | 88.037 |
| 1219.0 | 88.081 |
| 1218.0 | 87.917 |
| 1217.0 | 87.736 |
| 1216.0 | 87.615 |
| 1215.0 | 87.484 |
| 1214.0 | 87.343 |
| 1213.0 | 87.167 |
| 1212.0 | 87.096 |
| 1211.0 | 86.992 |
| 1210.0 | 86.866 |
| 1209.0 | 86.834 |
| 1208.0 | 86.719 |
| 1207.0 | 86.596 |
| 1206.0 | 86.56 |
| 1205.0 | 86.479 |
| 1204.0 | 86.45 |
| 1203.0 | 86.4 |
| 1202.0 | 86.435 |
| 1201.0 | 86.364 |
| 1200.0 | 86.253 |
| 1199.0 | 86.424 |
| 1198.0 | 86.35 |
| 1197.0 | 86.312 |
| 1196.0 | 86.475 |
| 1195.0 | 86.439 |
| 1194.0 | 86.491 |
| 1193.0 | 86.545 |
| 1192.0 | 86.605 |
| 1191.0 | 86.642 |
| 1190.0 | 86.736 |
| 1189.0 | 86.851 |
| 1188.0 | 87.053 |
| 1187.0 | 87.122 |
| 1186.0 | 87.289 |
| 1185.0 | 87.461 |
| 1184.0 | 87.722 |
| 1183.0 | 87.728 |
| 1182.0 | 87.929 |
| 1181.0 | 88.123 |
| 1180.0 | 88.124 |
| 1179.0 | 88.421 |
| 1178.0 | 88.501 |
| 1177.0 | 88.686 |
| 1176.0 | 88.703 |
| 1175.0 | 88.858 |
| 1174.0 | 88.964 |
| 1173.0 | 89.171 |
| 1172.0 | 89.233 |
| 1171.0 | 89.24 |
| 1170.0 | 89.395 |
| 1169.0 | 89.44 |
| 1168.0 | 89.496 |
| 1167.0 | 89.527 |
| 1166.0 | 89.509 |
| 1165.0 | 89.663 |
| 1164.0 | 89.693 |
| 1163.0 | 89.527 |
| 1162.0 | 89.681 |
| 1161.0 | 89.604 |
| 1160.0 | 89.543 |
| 1159.0 | 89.606 |
| 1158.0 | 89.513 |
| 1157.0 | 89.422 |
| 1156.0 | 89.304 |
| 1155.0 | 89.236 |
| 1154.0 | 89.127 |
| 1153.0 | 88.939 |
| 1152.0 | 88.965 |
| 1151.0 | 88.849 |
| 1150.0 | 88.631 |
| 1149.0 | 88.557 |
| 1148.0 | 88.431 |
| 1147.0 | 88.368 |
| 1146.0 | 88.193 |
| 1145.0 | 88.16 |
| 1144.0 | 87.967 |
| 1143.0 | 87.862 |
| 1142.0 | 87.87 |
| 1141.0 | 87.767 |
| 1140.0 | 87.669 |
| 1139.0 | 87.561 |
| 1138.0 | 87.428 |
| 1137.0 | 87.451 |
| 1136.0 | 87.381 |
| 1135.0 | 87.345 |
| 1134.0 | 87.446 |
| 1133.0 | 87.381 |
| 1132.0 | 87.394 |
| 1131.0 | 87.414 |
| 1130.0 | 87.582 |
| 1129.0 | 87.557 |
| 1128.0 | 87.676 |
| 1127.0 | 87.715 |
| 1126.0 | 87.933 |
| 1125.0 | 87.927 |
| 1124.0 | 88.074 |
| 1123.0 | 88.177 |
| 1122.0 | 88.251 |
| 1121.0 | 88.365 |
| 1120.0 | 88.554 |
| 1119.0 | 88.68 |
| 1118.0 | 88.797 |
| 1117.0 | 88.899 |
| 1116.0 | 89.15 |
| 1115.0 | 89.227 |
| 1114.0 | 89.333 |
| 1113.0 | 89.509 |
| 1112.0 | 89.584 |
| 1111.0 | 89.835 |
| 1110.0 | 89.925 |
| 1109.0 | 89.949 |
| 1108.0 | 90.099 |
| 1107.0 | 90.06 |
| 1106.0 | 90.232 |
| 1105.0 | 90.301 |
| 1104.0 | 90.328 |
| 1103.0 | 90.33 |
| 1102.0 | 90.391 |
| 1101.0 | 90.365 |
| 1100.0 | 90.178 |
| 1099.0 | 90.203 |
| 1098.0 | 90.196 |
| 1097.0 | 90.179 |
| 1096.0 | 90.037 |
| 1095.0 | 89.833 |
| 1094.0 | 89.762 |
| 1093.0 | 89.648 |
| 1092.0 | 89.434 |
| 1091.0 | 89.331 |
| 1090.0 | 89.135 |
| 1089.0 | 88.952 |
| 1088.0 | 88.831 |
| 1087.0 | 88.673 |
| 1086.0 | 88.465 |
| 1085.0 | 88.27 |
| 1084.0 | 88.107 |
| 1083.0 | 87.856 |
| 1082.0 | 87.742 |
| 1081.0 | 87.568 |
| 1080.0 | 87.328 |
| 1079.0 | 87.206 |
| 1078.0 | 87.066 |
| 1077.0 | 86.94 |
| 1076.0 | 86.844 |
| 1075.0 | 86.749 |
| 1074.0 | 86.602 |
| 1073.0 | 86.576 |
| 1072.0 | 86.47 |
| 1071.0 | 86.515 |
| 1070.0 | 86.595 |
| 1069.0 | 86.478 |
| 1068.0 | 86.506 |
| 1067.0 | 86.606 |
| 1066.0 | 86.599 |
| 1065.0 | 86.751 |
| 1064.0 | 86.8 |
| 1063.0 | 86.897 |
| 1062.0 | 86.976 |
| 1061.0 | 87.222 |
| 1060.0 | 87.343 |
| 1059.0 | 87.522 |
| 1058.0 | 87.685 |
| 1057.0 | 87.947 |
| 1056.0 | 88.132 |
| 1055.0 | 88.178 |
| 1054.0 | 88.394 |
| 1053.0 | 88.531 |
| 1052.0 | 88.79 |
| 1051.0 | 88.971 |
| 1050.0 | 89.178 |
| 1049.0 | 89.415 |
| 1048.0 | 89.461 |
| 1047.0 | 89.544 |
| 1046.0 | 89.777 |
| 1045.0 | 89.88 |
| 1044.0 | 89.864 |
| 1043.0 | 89.917 |
| 1042.0 | 90.033 |
| 1041.0 | 90.074 |
| 1040.0 | 90.134 |
| 1039.0 | 90.095 |
| 1038.0 | 90.07 |
| 1037.0 | 90.002 |
| 1036.0 | 89.919 |
| 1035.0 | 89.887 |
| 1034.0 | 89.763 |
| 1033.0 | 89.629 |
| 1032.0 | 89.569 |
| 1031.0 | 89.406 |
| 1030.0 | 89.179 |
| 1029.0 | 89.178 |
| 1028.0 | 88.929 |
| 1027.0 | 88.703 |
| 1026.0 | 88.57 |
| 1025.0 | 88.486 |
| 1024.0 | 88.293 |
| 1023.0 | 88.227 |
| 1022.0 | 88.051 |
| 1021.0 | 88.002 |
| 1020.0 | 87.869 |
| 1019.0 | 87.824 |
| 1018.0 | 87.768 |
| 1017.0 | 87.75 |
| 1016.0 | 87.636 |
| 1015.0 | 87.702 |
| 1014.0 | 87.578 |
| 1013.0 | 87.695 |
| 1012.0 | 87.651 |
| 1011.0 | 87.739 |
| 1010.0 | 87.905 |
| 1009.0 | 87.995 |
| 1008.0 | 88.125 |
| 1007.0 | 88.16 |
| 1006.0 | 88.311 |
| 1005.0 | 88.56 |
| 1004.0 | 88.697 |
| 1003.0 | 88.816 |
| 1002.0 | 89.031 |
| 1001.0 | 89.175 |
| 1000.0 | 89.359 |
| 999.0 | 89.471 |
| 998.0 | 89.657 |
| 997.0 | 89.859 |
| 996.0 | 89.829 |
| 995.0 | 89.979 |
| 994.0 | 90.166 |
| 993.0 | 90.22 |
| 992.0 | 90.205 |
| 991.0 | 90.294 |
| 990.0 | 90.331 |
| 989.0 | 90.373 |
| 988.0 | 90.31 |
| 987.0 | 90.343 |
| 986.0 | 90.259 |
| 985.0 | 90.217 |
| 984.0 | 90.039 |
| 983.0 | 90.022 |
| 982.0 | 89.852 |
| 981.0 | 89.827 |
| 980.0 | 89.684 |
| 979.0 | 89.536 |
| 978.0 | 89.478 |
| 977.0 | 89.372 |
| 976.0 | 89.155 |
| 975.0 | 89.114 |
| 974.0 | 89.007 |
| 973.0 | 88.955 |
| 972.0 | 88.836 |
| 971.0 | 88.707 |
| 970.0 | 88.79 |
| 969.0 | 88.747 |
| 968.0 | 88.839 |
| 967.0 | 88.699 |
| 966.0 | 88.718 |
| 965.0 | 88.792 |
| 964.0 | 88.97 |
| 963.0 | 88.894 |
| 962.0 | 89.051 |
| 961.0 | 89.143 |
| 960.0 | 89.225 |
| 959.0 | 89.331 |
| 958.0 | 89.463 |
| 957.0 | 89.584 |
| 956.0 | 89.781 |
| 955.0 | 89.843 |
| 954.0 | 90.032 |
| 953.0 | 90.048 |
| 952.0 | 90.105 |
| 951.0 | 90.148 |
| 950.0 | 90.225 |
| 949.0 | 90.246 |
| 948.0 | 90.293 |
| 947.0 | 90.396 |
| 946.0 | 90.287 |
| 945.0 | 90.196 |
| 944.0 | 90.26 |
| 943.0 | 90.304 |
| 942.0 | 90.141 |
| 941.0 | 90.021 |
| 940.0 | 89.936 |
| 939.0 | 89.804 |
| 938.0 | 89.686 |
| 937.0 | 89.487 |
| 936.0 | 89.418 |
| 935.0 | 89.336 |
| 934.0 | 89.172 |
| 933.0 | 89.072 |
| 932.0 | 88.975 |
| 931.0 | 88.724 |
| 930.0 | 88.724 |
| 929.0 | 88.656 |
| 928.0 | 88.649 |
| 927.0 | 88.57 |
| 926.0 | 88.603 |
| 925.0 | 88.621 |
| 924.0 | 88.595 |
| 923.0 | 88.626 |
| 922.0 | 88.571 |
| 921.0 | 88.669 |
| 920.0 | 88.652 |
| 919.0 | 88.772 |
| 918.0 | 88.751 |
| 917.0 | 88.871 |
| 916.0 | 88.923 |
| 915.0 | 89.074 |
| 914.0 | 89.076 |
| 913.0 | 89.239 |
| 912.0 | 89.251 |
| 911.0 | 89.432 |
| 910.0 | 89.425 |
| 909.0 | 89.506 |
| 908.0 | 89.575 |
| 907.0 | 89.597 |
| 906.0 | 89.627 |
| 905.0 | 89.661 |
| 904.0 | 89.679 |
| 903.0 | 89.761 |
| 902.0 | 89.69 |
| 901.0 | 89.649 |
| 900.0 | 89.736 |
| 899.0 | 89.706 |
| 898.0 | 89.723 |
| 897.0 | 89.742 |
| 896.0 | 89.738 |
| 895.0 | 89.682 |
| 894.0 | 89.668 |
| 893.0 | 89.671 |
| 892.0 | 89.645 |
| 891.0 | 89.643 |
| 890.0 | 89.607 |
| 889.0 | 89.725 |
| 888.0 | 89.745 |
| 887.0 | 89.665 |
| 886.0 | 89.575 |
| 885.0 | 89.615 |
| 884.0 | 89.614 |
| 883.0 | 89.646 |
| 882.0 | 89.673 |
| 881.0 | 89.607 |
| 880.0 | 89.597 |
| 879.0 | 89.574 |
| 878.0 | 89.535 |
| 877.0 | 89.476 |
| 876.0 | 89.486 |
| 875.0 | 89.499 |
| 874.0 | 89.475 |
| 873.0 | 89.359 |
| 872.0 | 89.511 |
| 871.0 | 89.476 |
| 870.0 | 89.495 |
| 869.0 | 89.571 |
| 868.0 | 89.594 |
| 867.0 | 89.725 |
| 866.0 | 89.659 |
| 865.0 | 89.727 |
| 864.0 | 89.78 |
| 863.0 | 89.897 |
| 862.0 | 89.995 |
| 861.0 | 89.952 |
| 860.0 | 90.131 |
| 859.0 | 90.203 |
| 858.0 | 90.215 |
| 857.0 | 90.259 |
| 856.0 | 90.372 |
| 855.0 | 90.282 |
| 854.0 | 90.283 |
| 853.0 | 90.454 |
| 852.0 | 90.489 |
| 851.0 | 90.385 |
| 850.0 | 90.483 |
| 849.0 | 90.323 |
| 848.0 | 90.427 |
| 847.0 | 90.409 |
| 846.0 | 90.388 |
| 845.0 | 90.441 |
| 844.0 | 90.437 |
| 843.0 | 90.443 |
| 842.0 | 90.499 |
| 841.0 | 90.479 |
| 840.0 | 90.406 |
| 839.0 | 90.544 |
| 838.0 | 90.51 |
| 837.0 | 90.403 |
| 836.0 | 90.485 |
| 835.0 | 90.465 |
| 834.0 | 90.514 |
| 833.0 | 90.453 |
| 832.0 | 90.437 |
| 831.0 | 90.465 |
| 830.0 | 90.347 |
| 829.0 | 90.289 |
| 828.0 | 90.176 |
| 827.0 | 90.194 |
| 826.0 | 90.18 |
| 825.0 | 89.994 |
| 824.0 | 89.914 |
| 823.0 | 89.803 |
| 822.0 | 89.584 |
| 821.0 | 89.486 |
| 820.0 | 89.252 |
| 819.0 | 88.922 |
| 818.0 | 88.777 |
| 817.0 | 88.496 |
| 816.0 | 88.239 |
| 815.0 | 88.009 |
| 814.0 | 87.512 |
| 813.0 | 87.315 |
| 812.0 | 86.819 |
| 811.0 | 86.419 |
| 810.0 | 86.01 |
| 809.0 | 85.592 |
| 808.0 | 85.283 |
| 807.0 | 84.878 |
| 806.0 | 84.163 |
| 805.0 | 82.784 |
| 804.0 | 80.368 |
| 803.0 | 76.993 |
| 802.0 | 72.599 |
| 801.0 | 67.038 |
| 800.0 | 60.623 |
| 799.0 | 60.748 |
| 798.0 | 41.038 |
| 797.0 | 23.967 |
| 796.0 | 12.797 |
| 795.0 | 6.649 |
| 794.0 | 3.486 |
| 793.0 | 1.875 |
| 792.0 | 1.04 |
| 791.0 | 0.596 |
| 790.0 | 0.351 |
| 789.0 | 0.211 |
| 788.0 | 0.13 |
| 787.0 | 0.082 |
| 786.0 | 0.052 |
| 785.0 | 0.034 |
| 784.0 | 0.023 |
| 783.0 | 0.015 |
| 782.0 | 0.01 |
| 781.0 | 0.007 |
| 780.0 | 0.005 |
| 779.0 | 0.003 |
| 778.0 | 0.002 |
| 777.0 | 0.002 |
| 776.0 | 0.001 |
| 775.0 | 0.001 |
| 774.0 | 0.001 |
| 773.0 | 0 |
| 772.0 | 0 |
| 771.0 | 0 |
| 770.0 | 0 |
| 769.0 | 0 |
| 768.0 | 0 |
| 767.0 | 0 |
| 766.0 | 0 |
| 765.0 | 0 |
| 764.0 | 0 |
| 763.0 | 0 |
| 762.0 | 0 |
| 761.0 | 0 |
| 760.0 | 0 |
| 759.0 | 0 |
| 758.0 | 0 |
| 757.0 | 0 |
| 756.0 | 0 |
| 755.0 | 0 |
| 754.0 | 0 |
| 753.0 | 0 |
| 752.0 | 0 |
| 751.0 | 0 |
| 750.0 | 0 |
| 749.0 | 0 |
| 748.0 | 0 |
| 747.0 | 0 |
| 746.0 | 0 |
| 745.0 | 0 |
| 744.0 | 0 |
| 743.0 | 0 |
| 742.0 | 0 |
| 741.0 | 0 |
| 740.0 | 0 |
| 739.0 | 0 |
| 738.0 | 0 |
| 737.0 | 0 |
| 736.0 | 0 |
| 735.0 | 0 |
| 734.0 | 0 |
| 733.0 | 0 |
| 732.0 | 0 |
| 731.0 | 0 |
| 730.0 | 0 |
| 729.0 | 0 |
| 728.0 | 0 |
| 727.0 | 0 |
| 726.0 | 0 |
| 725.0 | 0 |
| 724.0 | 0 |
| 723.0 | 0 |
| 722.0 | 0 |
| 721.0 | 0 |
| 720.0 | 0 |
| 719.0 | 0 |
| 718.0 | 0 |
| 717.0 | 0 |
| 716.0 | 0 |
| 715.0 | 0 |
| 714.0 | 0 |
| 713.0 | 0 |
| 712.0 | 0 |
| 711.0 | 0 |
| 710.0 | 0 |
| 709.0 | 0 |
| 708.0 | 0 |
| 707.0 | 0 |
| 706.0 | 0 |
| 705.0 | 0 |
| 704.0 | 0 |
| 703.0 | 0 |
| 702.0 | 0 |
| 701.0 | 0 |
| 700.0 | 0 |
| 699.0 | 0 |
| 698.0 | 0 |
| 697.0 | 0 |
| 696.0 | 0 |
| 695.0 | 0 |
| 694.0 | 0 |
| 693.0 | 0 |
| 692.0 | 0 |
| 691.0 | 0 |
| 690.0 | 0 |
| 689.0 | 0 |
| 688.0 | 0 |
| 687.0 | 0 |
| 686.0 | 0 |
| 685.0 | 0 |
| 684.0 | 0 |
| 683.0 | 0 |
| 682.0 | 0 |
| 681.0 | 0 |
| 680.0 | 0 |
| 679.0 | 0 |
| 678.0 | 0 |
| 677.0 | 0 |
| 676.0 | 0 |
| 675.0 | 0 |
| 674.0 | 0 |
| 673.0 | 0 |
| 672.0 | 0 |
| 671.0 | 0 |
| 670.0 | 0 |
| 669.0 | 0 |
| 668.0 | 0 |
| 667.0 | 0 |
| 666.0 | 0 |
| 665.0 | 0 |
| 664.0 | 0 |
| 663.0 | 0 |
| 662.0 | 0 |
| 661.0 | 0 |
| 660.0 | 0 |
| 659.0 | 0 |
| 658.0 | 0 |
| 657.0 | 0 |
| 656.0 | 0 |
| 655.0 | 0 |
| 654.0 | 0 |
| 653.0 | 0 |
| 652.0 | 0 |
| 651.0 | 0 |
| 650.0 | 0 |
| 649.0 | 0 |
| 648.0 | 0 |
| 647.0 | 0 |
| 646.0 | 0 |
| 645.0 | 0 |
| 644.0 | 0 |
| 643.0 | 0 |
| 642.0 | 0 |
| 641.0 | 0 |
| 640.0 | 0 |
| 639.0 | 0 |
| 638.0 | 0 |
| 637.0 | 0 |
| 636.0 | 0 |
| 635.0 | 0 |
| 634.0 | 0 |
| 633.0 | 0 |
| 632.0 | 0 |
| 631.0 | 0 |
| 630.0 | 0 |
| 629.0 | 0 |
| 628.0 | 0 |
| 627.0 | 0 |
| 626.0 | 0 |
| 625.0 | 0 |
| 624.0 | 0 |
| 623.0 | 0 |
| 622.0 | 0 |
| 621.0 | 0 |
| 620.0 | 0 |
| 619.0 | 0 |
| 618.0 | 0 |
| 617.0 | 0 |
| 616.0 | 0 |
| 615.0 | 0 |
| 614.0 | 0 |
| 613.0 | 0 |
| 612.0 | 0 |
| 611.0 | 0 |
| 610.0 | 0 |
| 609.0 | 0 |
| 608.0 | 0 |
| 607.0 | 0 |
| 606.0 | 0 |
| 605.0 | 0 |
| 604.0 | 0 |
| 603.0 | 0 |
| 602.0 | 0 |
| 601.0 | 0 |
| 600.0 | 0 |
| 599.0 | 0 |
| 598.0 | 0 |
| 597.0 | 0 |
| 596.0 | 0 |
| 595.0 | 0 |
| 594.0 | 0 |
| 593.0 | 0 |
| 592.0 | 0 |
| 591.0 | 0 |
| 590.0 | 0 |
| 589.0 | 0 |
| 588.0 | 0 |
| 587.0 | 0 |
| 586.0 | 0 |
| 585.0 | 0 |
| 584.0 | 0 |
| 583.0 | 0 |
| 582.0 | 0 |
| 581.0 | 0 |
| 580.0 | 0 |
| 579.0 | 0 |
| 578.0 | 0 |
| 577.0 | 0 |
| 576.0 | 0 |
| 575.0 | 0 |
| 574.0 | 0 |
| 573.0 | 0 |
| 572.0 | 0 |
| 571.0 | 0 |
| 570.0 | 0 |
| 569.0 | 0 |
| 568.0 | 0 |
| 567.0 | 0 |
| 566.0 | 0 |
| 565.0 | 0 |
| 564.0 | 0 |
| 563.0 | 0 |
| 562.0 | 0 |
| 561.0 | 0 |
| 560.0 | 0 |
| 559.0 | 0 |
| 558.0 | 0 |
| 557.0 | 0 |
| 556.0 | 0 |
| 555.0 | 0 |
| 554.0 | 0 |
| 553.0 | 0 |
| 552.0 | 0 |
| 551.0 | 0 |
| 550.0 | 0 |
| 549.0 | 0 |
| 548.0 | 0 |
| 547.0 | 0 |
| 546.0 | 0 |
| 545.0 | 0 |
| 544.0 | 0 |
| 543.0 | 0 |
| 542.0 | 0 |
| 541.0 | 0 |
| 540.0 | 0 |
| 539.0 | 0 |
| 538.0 | 0 |
| 537.0 | 0 |
| 536.0 | 0 |
| 535.0 | 0 |
| 534.0 | 0 |
| 533.0 | 0 |
| 532.0 | 0 |
| 531.0 | 0 |
| 530.0 | 0 |
| 529.0 | 0 |
| 528.0 | 0 |
| 527.0 | 0 |
| 526.0 | 0 |
| 525.0 | 0 |
| 524.0 | 0 |
| 523.0 | 0 |
| 522.0 | 0 |
| 521.0 | 0 |
| 520.0 | 0 |
| 519.0 | 0 |
| 518.0 | 0 |
| 517.0 | 0 |
| 516.0 | 0 |
| 515.0 | 0 |
| 514.0 | 0 |
| 513.0 | 0 |
| 512.0 | 0 |
| 511.0 | 0 |
| 510.0 | 0 |
| 509.0 | 0 |
| 508.0 | 0 |
| 507.0 | 0 |
| 506.0 | 0 |
| 505.0 | 0 |
| 504.0 | 0 |
| 503.0 | 0 |
| 502.0 | 0 |
| 501.0 | 0 |
| 500.0 | 0 |
| 499.0 | 0 |
| 498.0 | 0 |
| 497.0 | 0 |
| 496.0 | 0 |
| 495.0 | 0 |
| 494.0 | 0 |
| 493.0 | 0 |
| 492.0 | 0 |
| 491.0 | 0 |
| 490.0 | 0 |
| 489.0 | 0 |
| 488.0 | 0 |
| 487.0 | 0 |
| 486.0 | 0 |
| 485.0 | 0 |
| 484.0 | 0 |
| 483.0 | 0 |
| 482.0 | 0 |
| 481.0 | 0 |
| 480.0 | 0 |
| 479.0 | 0 |
| 478.0 | 0 |
| 477.0 | 0 |
| 476.0 | 0 |
| 475.0 | 0 |
| 474.0 | 0 |
| 473.0 | 0 |
| 472.0 | 0 |
| 471.0 | 0 |
| 470.0 | 0 |
| 469.0 | 0 |
| 468.0 | 0 |
| 467.0 | 0 |
| 466.0 | 0 |
| 465.0 | 0 |
| 464.0 | 0 |
| 463.0 | 0 |
| 462.0 | 0 |
| 461.0 | 0 |
| 460.0 | 0 |
| 459.0 | 0 |
| 458.0 | 0 |
| 457.0 | 0 |
| 456.0 | 0 |
| 455.0 | 0 |
| 454.0 | 0 |
| 453.0 | 0 |
| 452.0 | 0 |
| 451.0 | 0 |
| 450.0 | 0 |
| 449.0 | 0 |
| 448.0 | 0 |
| 447.0 | 0 |
| 446.0 | 0 |
| 445.0 | 0 |
| 444.0 | 0 |
| 443.0 | 0 |
| 442.0 | 0 |
| 441.0 | 0 |
| 440.0 | 0 |
| 439.0 | 0 |
| 438.0 | 0 |
| 437.0 | 0 |
| 436.0 | 0 |
| 435.0 | 0 |
| 434.0 | 0 |
| 433.0 | 0 |
| 432.0 | 0 |
| 431.0 | 0 |
| 430.0 | 0 |
| 429.0 | 0 |
| 428.0 | 0 |
| 427.0 | 0 |
| 426.0 | 0 |
| 425.0 | 0 |
| 424.0 | 0 |
| 423.0 | 0 |
| 422.0 | 0 |
| 421.0 | 0 |
| 420.0 | 0 |
| 419.0 | 0 |
| 418.0 | 0 |
| 417.0 | 0 |
| 416.0 | 0 |
| 415.0 | 0 |
| 414.0 | 0 |
| 413.0 | 0 |
| 412.0 | 0 |
| 411.0 | 0 |
| 410.0 | 0 |
| 409.0 | 0 |
| 408.0 | 0 |
| 407.0 | 0 |
| 406.0 | 0 |
| 405.0 | 0 |
| 404.0 | 0 |
| 403.0 | 0 |
| 402.0 | 0 |
| 401.0 | 0 |
| 400.0 | 0 |
| 399.0 | 0 |
| 398.0 | 0 |
| 397.0 | 0 |
| 396.0 | 0 |
| 395.0 | 0 |
| 394.0 | 0 |
| 393.0 | 0 |
| 392.0 | 0 |
| 391.0 | 0 |
| 390.0 | 0 |
| 389.0 | 0 |
| 388.0 | 0 |
| 387.0 | 0 |
| 386.0 | 0 |
| 385.0 | 0 |
| 384.0 | 0 |
| 383.0 | 0 |
| 382.0 | 0 |
| 381.0 | 0 |
| 380.0 | 0 |
| 379.0 | 0 |
| 378.0 | 0 |
| 377.0 | 0 |
| 376.0 | 0 |
| 375.0 | 0 |
| 374.0 | 0 |
| 373.0 | 0 |
| 372.0 | 0 |
| 371.0 | 0 |
| 370.0 | 0 |
| 369.0 | 0 |
| 368.0 | 0 |
| 367.0 | 0 |
| 366.0 | 0 |
| 365.0 | 0 |
| 364.0 | 0 |
| 363.0 | 0 |
| 362.0 | 0 |
| 361.0 | 0 |
| 360.0 | 0 |
| 359.0 | 0 |
| 358.0 | 0 |
| 357.0 | 0 |
| 356.0 | 0 |
| 355.0 | 0 |
| 354.0 | 0 |
| 353.0 | 0 |
| 352.0 | 0 |
| 351.0 | 0 |
| 350.0 | 0 |
| 349.0 | 0 |
| 348.0 | 0 |
| 347.0 | 0 |
| 346.0 | 0 |
| 345.0 | 0 |
| 344.0 | 0 |
| 343.0 | 0 |
| 342.0 | 0 |
| 341.0 | 0 |
| 340.0 | 0 |
| 339.0 | 0 |
| 338.0 | 0 |
| 337.0 | 0 |
| 336.0 | 0 |
| 335.0 | 0 |
| 334.0 | 0 |
| 333.0 | 0 |
| 332.0 | 0 |
| 331.0 | 0 |
| 330.0 | 0 |
| 329.0 | 0 |
| 328.0 | 0 |
| 327.0 | 0 |
| 326.0 | 0 |
| 325.0 | 0 |
| 324.0 | 0 |
| 323.0 | 0 |
| 322.0 | 0 |
| 321.0 | 0 |
| 320.0 | 0 |
| 319.0 | 0 |
| 318.0 | 0 |
| 317.0 | 0 |
| 316.0 | 0 |
| 315.0 | 0 |
| 314.0 | 0 |
| 313.0 | 0 |
| 312.0 | 0 |
| 311.0 | 0 |
| 310.0 | 0 |
| 309.0 | 0 |
| 308.0 | 0 |
| 307.0 | 0 |
| 306.0 | 0 |
| 305.0 | 0 |
| 304.0 | 0 |
| 303.0 | 0 |
| 302.0 | 0 |
| 301.0 | 0 |
| 300.0 | 0 |
| 299.0 | 0 |
| 298.0 | 0 |
| 297.0 | 0 |
| 296.0 | 0 |
| 295.0 | 0 |
| 294.0 | 0 |
| 293.0 | 0 |
| 292.0 | 0 |
| 291.0 | 0 |
| 290.0 | 0 |
| 289.0 | 0 |
| 288.0 | 0 |
| 287.0 | 0 |
| 286.0 | 0 |
| 285.0 | 0 |
| 284.0 | 0 |
| 283.0 | 0 |
| 282.0 | 0 |
| 281.0 | 0 |
| 280.0 | 0 |
| 279.0 | 0 |
| 278.0 | 0 |
| 277.0 | 0 |
| 276.0 | 0 |
| 275.0 | 0 |
| 274.0 | 0 |
| 273.0 | 0 |
| 272.0 | 0 |
| 271.0 | 0 |
| 270.0 | 0 |
| 269.0 | 0 |
| 268.0 | 0 |
| 267.0 | 0 |
| 266.0 | 0 |
| 265.0 | 0 |
| 264.0 | 0 |
| 263.0 | 0 |
| 262.0 | 0 |
| 261.0 | 0 |
| 260.0 | 0 |
| 259.0 | 0 |
| 258.0 | 0 |
| 257.0 | 0 |
| 256.0 | 0 |
| 255.0 | 0 |
| 254.0 | 0 |
| 253.0 | 0 |
| 252.0 | 0 |
| 251.0 | 0 |
| 250.0 | 0 |
| 249.0 | 0 |
| 248.0 | 0 |
| 247.0 | 0 |
| 246.0 | 0 |
| 245.0 | 0 |
| 244.0 | 0 |
| 243.0 | 0 |
| 242.0 | 0 |
| 241.0 | 0 |
| 240.0 | 0 |
| 239.0 | 0 |
| 238.0 | 0 |
| 237.0 | 0 |
| 236.0 | 0 |
| 235.0 | 0 |
| 234.0 | 0 |
| 233.0 | 0 |
| 232.0 | 0 |
| 231.0 | 0 |
| 230.0 | 0 |
| 229.0 | 0 |
| 228.0 | 0 |
| 227.0 | 0 |
| 226.0 | 0 |
| 225.0 | 0 |
| 224.0 | 0 |
| 223.0 | 0 |
| 222.0 | 0 |
| 221.0 | 0 |
| 220.0 | 0 |
| 219.0 | 0 |
| 218.0 | 0 |
| 217.0 | 0 |
| 216.0 | 0 |
| 215.0 | 0 |
| 214.0 | 0 |
| 213.0 | 0 |
| 212.0 | 0 |
| 211.0 | 0 |
| 210.0 | 0 |
| 209.0 | 0 |
| 208.0 | 0 |
| 207.0 | 0 |
| 206.0 | 0 |